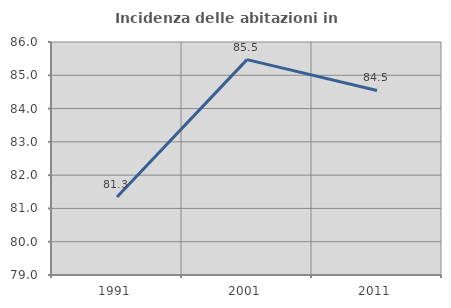
| Category | Incidenza delle abitazioni in proprietà  |
|---|---|
| 1991.0 | 81.343 |
| 2001.0 | 85.47 |
| 2011.0 | 84.545 |